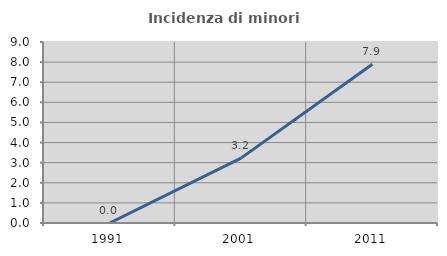
| Category | Incidenza di minori stranieri |
|---|---|
| 1991.0 | 0 |
| 2001.0 | 3.226 |
| 2011.0 | 7.895 |